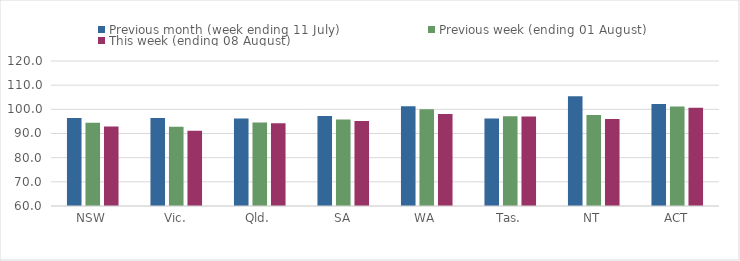
| Category | Previous month (week ending 11 July) | Previous week (ending 01 August) | This week (ending 08 August) |
|---|---|---|---|
| NSW | 96.424 | 94.457 | 92.913 |
| Vic. | 96.393 | 92.791 | 91.153 |
| Qld. | 96.22 | 94.523 | 94.198 |
| SA | 97.26 | 95.821 | 95.126 |
| WA | 101.247 | 100.021 | 98.057 |
| Tas. | 96.165 | 97.095 | 97.081 |
| NT | 105.421 | 97.628 | 96.038 |
| ACT | 102.25 | 101.2 | 100.7 |